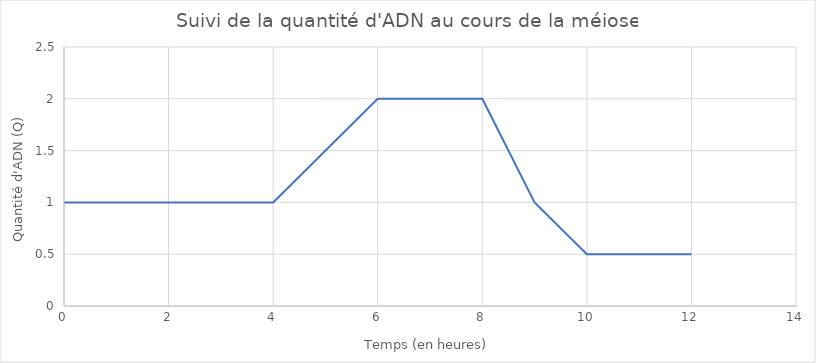
| Category | Quantité d'ADN (Q) |
|---|---|
| 0.0 | 1 |
| 2.0 | 1 |
| 4.0 | 1 |
| 6.0 | 2 |
| 8.0 | 2 |
| 9.0 | 1 |
| 10.0 | 0.5 |
| 12.0 | 0.5 |